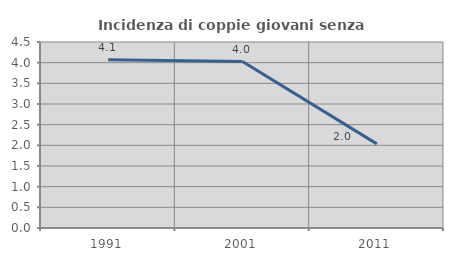
| Category | Incidenza di coppie giovani senza figli |
|---|---|
| 1991.0 | 4.072 |
| 2001.0 | 4.026 |
| 2011.0 | 2.035 |